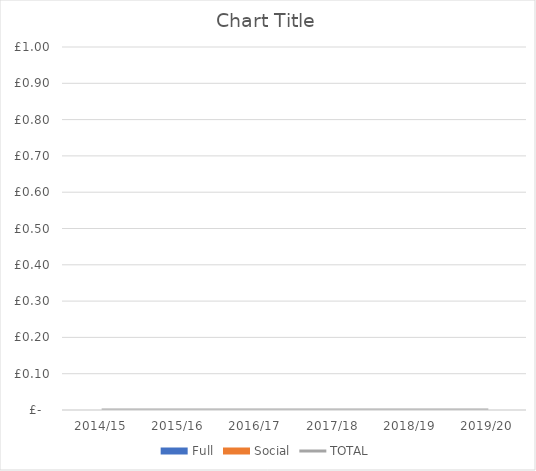
| Category | Full | Social |
|---|---|---|
| 2014/15 | 0 | 0 |
| 2015/16 | 0 | 0 |
| 2016/17 | 0 | 0 |
| 2017/18 | 0 | 0 |
| 2018/19 | 0 | 0 |
| 2019/20 | 0 | 0 |